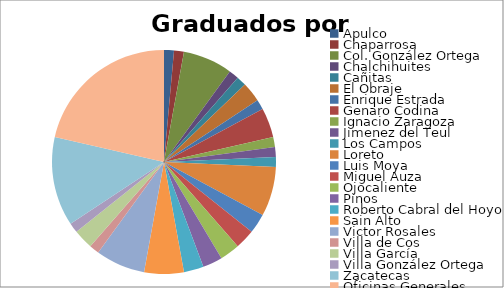
| Category | Series 0 |
|---|---|
| Apulco | 1 |
| Chaparrosa | 1 |
| Col. González Ortega | 5 |
| Chalchihuites | 1 |
| Cañitas | 1 |
| El Obraje | 2 |
| Enrique Estrada | 1 |
| Genaro Codina | 3 |
| Ignacio Zaragoza | 1 |
| Jimenez del Teul | 1 |
| Los Campos | 1 |
| Loreto | 5 |
| Luis Moya | 2 |
| Miguel Auza | 2 |
| Ojocaliente | 2 |
| Pinos | 2 |
| Roberto Cabral del Hoyo | 2 |
| Sain Alto | 4 |
| Victor Rosales | 5 |
| Villa de Cos | 1 |
| Villa García | 2 |
| Villa González Ortega | 1 |
| Zacatecas | 9 |
| Oficinas Generales | 15 |